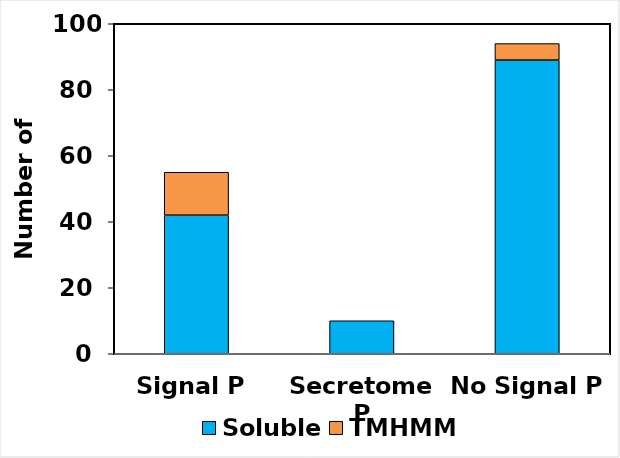
| Category | Soluble | TMHMM |
|---|---|---|
| Signal P | 42 | 13 |
| Secretome P | 10 | 0 |
| No Signal P  | 89 | 5 |